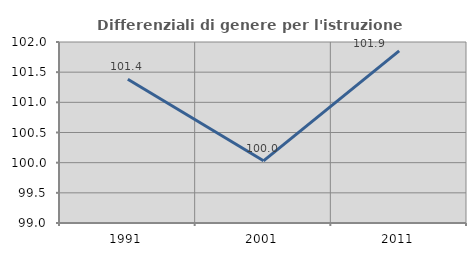
| Category | Differenziali di genere per l'istruzione superiore |
|---|---|
| 1991.0 | 101.383 |
| 2001.0 | 100.031 |
| 2011.0 | 101.853 |